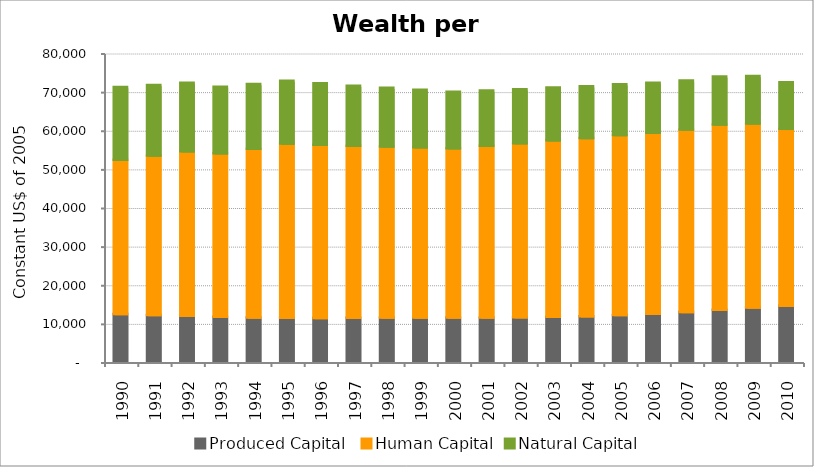
| Category | Produced Capital  | Human Capital | Natural Capital |
|---|---|---|---|
| 1990.0 | 12333.554 | 39961.834 | 18810.756 |
| 1991.0 | 12130.576 | 41247.538 | 18282.158 |
| 1992.0 | 11887.503 | 42615.861 | 17748.721 |
| 1993.0 | 11646.147 | 42319.821 | 17226.781 |
| 1994.0 | 11465.604 | 43707.093 | 16736.562 |
| 1995.0 | 11366.239 | 45122.605 | 16291.575 |
| 1996.0 | 11340.718 | 44841.152 | 15901.315 |
| 1997.0 | 11364.447 | 44560.215 | 15538.125 |
| 1998.0 | 11424.266 | 44315.029 | 15205.127 |
| 1999.0 | 11428.431 | 44099.856 | 14892.905 |
| 2000.0 | 11448.946 | 43843.662 | 14586.442 |
| 2001.0 | 11477.967 | 44456.645 | 14281.361 |
| 2002.0 | 11521.654 | 45069.805 | 13990.045 |
| 2003.0 | 11624.663 | 45695.666 | 13702.23 |
| 2004.0 | 11810.306 | 46111.873 | 13419.864 |
| 2005.0 | 12071.405 | 46617.279 | 13159.01 |
| 2006.0 | 12421.888 | 46892.153 | 12900.497 |
| 2007.0 | 12885.391 | 47238.749 | 12670.866 |
| 2008.0 | 13476.792 | 47937.222 | 12459.733 |
| 2009.0 | 14013.86 | 47693.565 | 12256.639 |
| 2010.0 | 14486.444 | 45823.762 | 12068.355 |